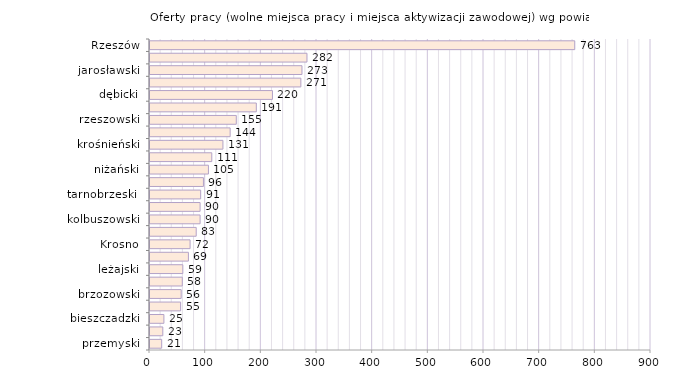
| Category | Oferty pracy (wolne miejsca pracy i miejsca aktywizacji zawodowej) wg powiatów |
|---|---|
| przemyski | 21 |
| leski | 23 |
| bieszczadzki | 25 |
| Przemyśl | 55 |
| brzozowski | 56 |
| łańcucki | 58 |
| leżajski | 59 |
| Tarnobrzeg | 69 |
| Krosno | 72 |
| ropczycko-sędziszowski | 83 |
| kolbuszowski | 90 |
| sanocki | 90 |
| tarnobrzeski  | 91 |
| stalowowolski | 96 |
| niżański | 105 |
| lubaczowski | 111 |
| krośnieński | 131 |
| strzyżowski | 144 |
| rzeszowski | 155 |
| jasielski | 191 |
| dębicki | 220 |
| mielecki | 271 |
| jarosławski | 273 |
| przeworski | 282 |
| Rzeszów | 763 |